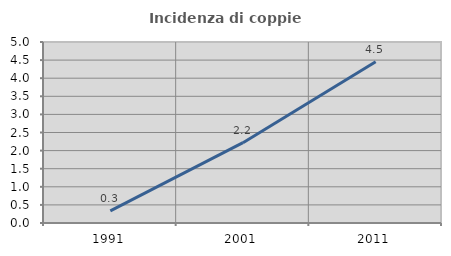
| Category | Incidenza di coppie miste |
|---|---|
| 1991.0 | 0.333 |
| 2001.0 | 2.219 |
| 2011.0 | 4.456 |